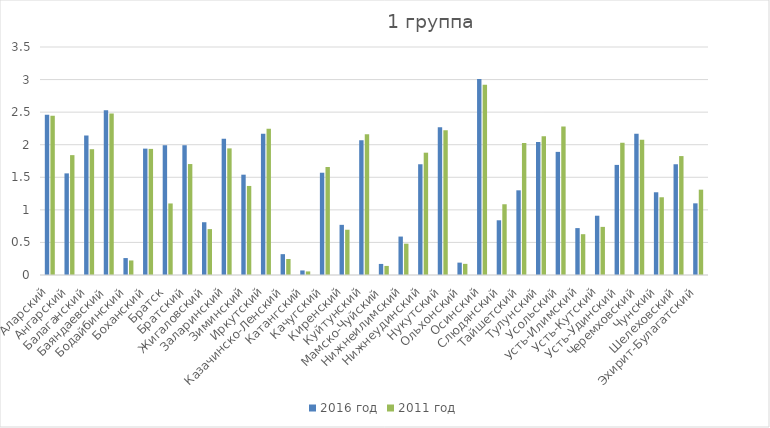
| Category | 2016 год | 2011 год |
|---|---|---|
| Аларский | 2.46 | 2.443 |
| Ангарский | 1.56 | 1.84 |
| Балаганский | 2.14 | 1.931 |
| Баяндаевский | 2.53 | 2.477 |
| Бодайбинский | 0.26 | 0.223 |
| Боханский | 1.94 | 1.936 |
| Братск | 1.99 | 1.098 |
| Братский | 1.99 | 1.703 |
| Жигаловский | 0.81 | 0.704 |
| Заларинский | 2.09 | 1.944 |
| Зиминский | 1.54 | 1.367 |
| Иркутский | 2.17 | 2.244 |
| Казачинско-Ленский | 0.32 | 0.245 |
| Катангский | 0.07 | 0.055 |
| Качугский | 1.57 | 1.658 |
| Киренский | 0.77 | 0.695 |
| Куйтунский | 2.07 | 2.159 |
| Мамско-Чуйский | 0.17 | 0.139 |
| Нижнеилимский | 0.59 | 0.481 |
| Нижнеудинский | 1.7 | 1.878 |
| Нукутский | 2.27 | 2.222 |
| Ольхонский | 0.19 | 0.171 |
| Осинский | 3.01 | 2.922 |
| Слюдянский | 0.84 | 1.086 |
| Тайшетский | 1.3 | 2.028 |
| Тулунский | 2.04 | 2.13 |
| Усольский | 1.89 | 2.279 |
| Усть-Илимский | 0.72 | 0.626 |
| Усть-Кутский | 0.91 | 0.739 |
| Усть-Удинский | 1.69 | 2.031 |
| Черемховский | 2.17 | 2.075 |
| Чунский | 1.27 | 1.193 |
| Шелеховский | 1.7 | 1.826 |
| Эхирит-Булагатский | 1.1 | 1.31 |